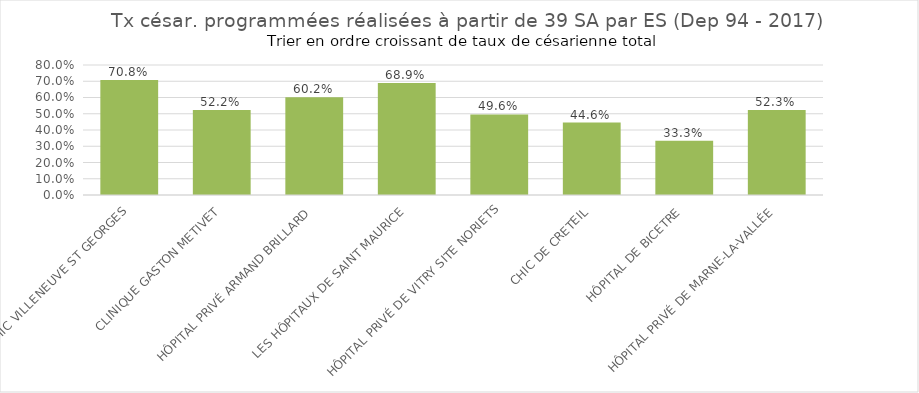
| Category | Tx césar. programmées 
réalisées à partir de 39 SA |
|---|---|
| CHIC VILLENEUVE ST GEORGES | 0.708 |
| CLINIQUE GASTON METIVET | 0.522 |
| HÔPITAL PRIVÉ ARMAND BRILLARD | 0.602 |
| LES HÔPITAUX DE SAINT MAURICE | 0.689 |
| HÔPITAL PRIVÉ DE VITRY SITE NORIETS | 0.496 |
| CHIC DE CRETEIL | 0.446 |
| HÔPITAL DE BICETRE | 0.333 |
| HÔPITAL PRIVÉ DE MARNE-LA-VALLÉE | 0.523 |